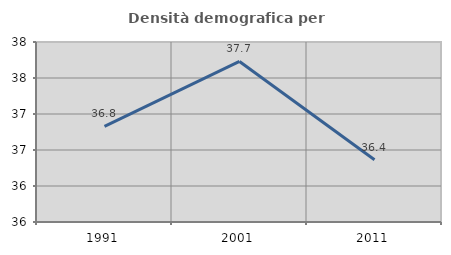
| Category | Densità demografica |
|---|---|
| 1991.0 | 36.828 |
| 2001.0 | 37.73 |
| 2011.0 | 36.364 |